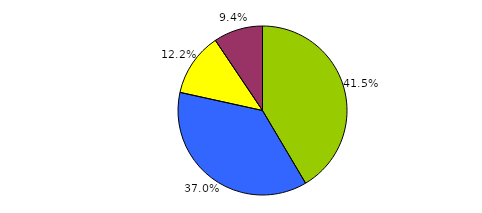
| Category | Series 0 |
|---|---|
| 0 | 458 |
| 1 | 408 |
| 2 | 134 |
| 3 | 104 |